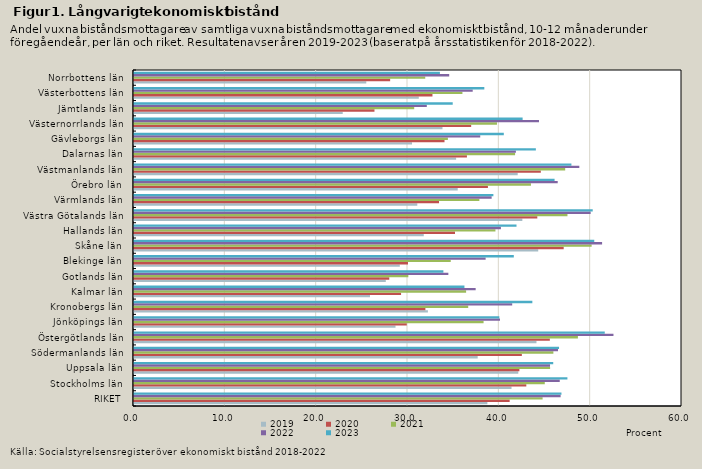
| Category | 2019 | 2020 | 2021 | 2022 | 2023 |
|---|---|---|---|---|---|
| RIKET | 38.691 | 41.13 | 44.738 | 46.711 | 46.802 |
| Stockholms län | 41.334 | 42.954 | 44.975 | 46.615 | 47.454 |
| Uppsala län | 42.076 | 42.198 | 45.559 | 45.552 | 45.901 |
| Södermanlands län | 37.63 | 42.465 | 45.918 | 46.423 | 46.537 |
| Östergötlands län | 44.066 | 45.53 | 48.603 | 52.496 | 51.543 |
| Jönköpings län | 28.633 | 29.866 | 38.275 | 40.072 | 40 |
| Kronobergs län | 32.179 | 31.904 | 36.593 | 41.409 | 43.614 |
| Kalmar län | 25.838 | 29.24 | 36.362 | 37.407 | 36.18 |
| Gotlands län | 27.57 | 27.95 | 30.038 | 34.418 | 33.874 |
| Blekinge län | 29.103 | 29.997 | 34.679 | 38.499 | 41.585 |
| Skåne län | 44.258 | 47.046 | 50.107 | 51.251 | 50.394 |
| Hallands län | 31.727 | 35.146 | 39.573 | 40.171 | 41.881 |
| Västra Götalands län | 42.519 | 44.158 | 47.46 | 49.997 | 50.225 |
| Värmlands län | 31.018 | 33.397 | 37.813 | 39.158 | 39.348 |
| Örebro län | 35.443 | 38.75 | 43.462 | 46.392 | 46.048 |
| Västmanlands län | 42.01 | 44.544 | 47.211 | 48.758 | 47.892 |
| Dalarnas län | 35.268 | 36.451 | 41.726 | 41.813 | 43.999 |
| Gävleborgs län | 30.441 | 33.997 | 34.368 | 37.909 | 40.489 |
| Västernorrlands län | 33.776 | 36.917 | 39.741 | 44.342 | 42.55 |
| Jämtlands län | 22.853 | 26.33 | 30.679 | 32.059 | 34.896 |
| Västerbottens län | 31.181 | 32.677 | 35.959 | 37.085 | 38.356 |
| Norrbottens län | 25.431 | 28.044 | 31.888 | 34.512 | 33.494 |